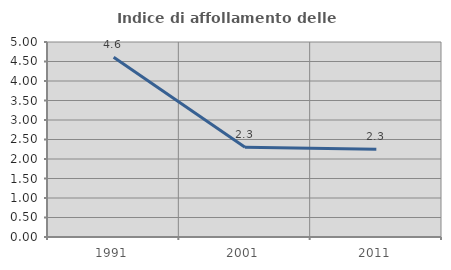
| Category | Indice di affollamento delle abitazioni  |
|---|---|
| 1991.0 | 4.606 |
| 2001.0 | 2.3 |
| 2011.0 | 2.251 |